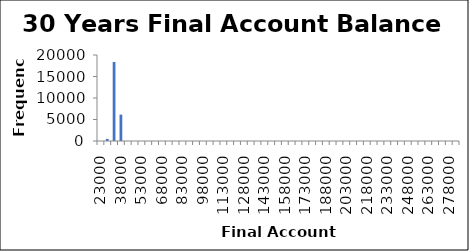
| Category | Frequency |
|---|---|
| 23000.0 | 0 |
| 28000.0 | 485 |
| 33000.0 | 18366 |
| 38000.0 | 6137 |
| 43000.0 | 12 |
| 48000.0 | 0 |
| 53000.0 | 0 |
| 58000.0 | 0 |
| 63000.0 | 0 |
| 68000.0 | 0 |
| 73000.0 | 0 |
| 78000.0 | 0 |
| 83000.0 | 0 |
| 88000.0 | 0 |
| 93000.0 | 0 |
| 98000.0 | 0 |
| 103000.0 | 0 |
| 108000.0 | 0 |
| 113000.0 | 0 |
| 118000.0 | 0 |
| 123000.0 | 0 |
| 128000.0 | 0 |
| 133000.0 | 0 |
| 138000.0 | 0 |
| 143000.0 | 0 |
| 148000.0 | 0 |
| 153000.0 | 0 |
| 158000.0 | 0 |
| 163000.0 | 0 |
| 168000.0 | 0 |
| 173000.0 | 0 |
| 178000.0 | 0 |
| 183000.0 | 0 |
| 188000.0 | 0 |
| 193000.0 | 0 |
| 198000.0 | 0 |
| 203000.0 | 0 |
| 208000.0 | 0 |
| 213000.0 | 0 |
| 218000.0 | 0 |
| 223000.0 | 0 |
| 228000.0 | 0 |
| 233000.0 | 0 |
| 238000.0 | 0 |
| 243000.0 | 0 |
| 248000.0 | 0 |
| 253000.0 | 0 |
| 258000.0 | 0 |
| 263000.0 | 0 |
| 268000.0 | 0 |
| 273000.0 | 0 |
| 278000.0 | 0 |
| More | 0 |